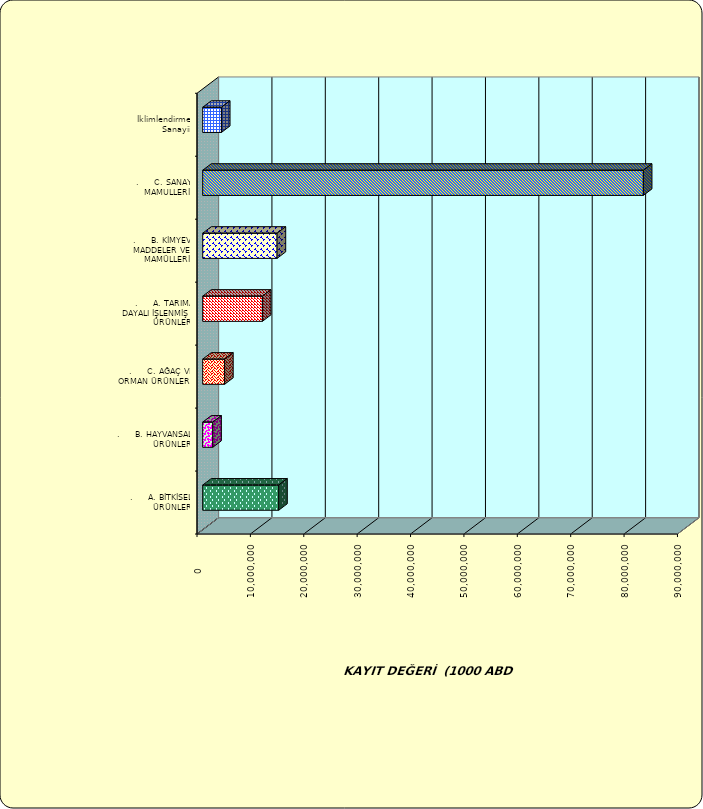
| Category | Series 0 |
|---|---|
| .     A. BİTKİSEL ÜRÜNLER | 14235097.14 |
| .     B. HAYVANSAL ÜRÜNLER | 1891071.518 |
| .     C. AĞAÇ VE ORMAN ÜRÜNLERİ | 4102998.65 |
| .     A. TARIMA DAYALI İŞLENMİŞ ÜRÜNLER | 11180571.585 |
| .     B. KİMYEVİ MADDELER VE MAMÜLLERİ | 13936293.72 |
| .     C. SANAYİ MAMULLERİ | 82543459.84 |
|  İklimlendirme Sanayii | 3509230.927 |